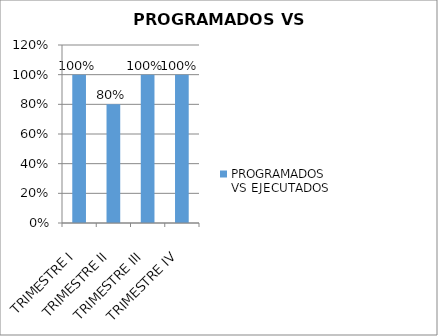
| Category | PROGRAMADOS VS EJECUTADOS |
|---|---|
| TRIMESTRE I | 1 |
| TRIMESTRE II | 0.8 |
| TRIMESTRE III | 1 |
| TRIMESTRE IV | 1 |